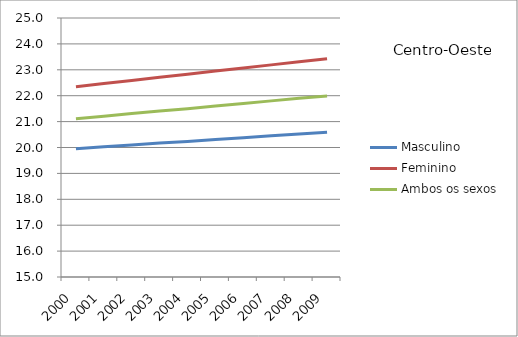
| Category | Masculino | Feminino | Ambos os sexos |
|---|---|---|---|
| 2000.0 | 19.95 | 22.35 | 21.11 |
| 2001.0 | 20.03 | 22.47 | 21.21 |
| 2002.0 | 20.1 | 22.59 | 21.31 |
| 2003.0 | 20.17 | 22.71 | 21.41 |
| 2004.0 | 20.23 | 22.83 | 21.5 |
| 2005.0 | 20.31 | 22.95 | 21.6 |
| 2006.0 | 20.38 | 23.07 | 21.7 |
| 2007.0 | 20.45 | 23.19 | 21.8 |
| 2008.0 | 20.52 | 23.31 | 21.9 |
| 2009.0 | 20.59 | 23.43 | 21.99 |